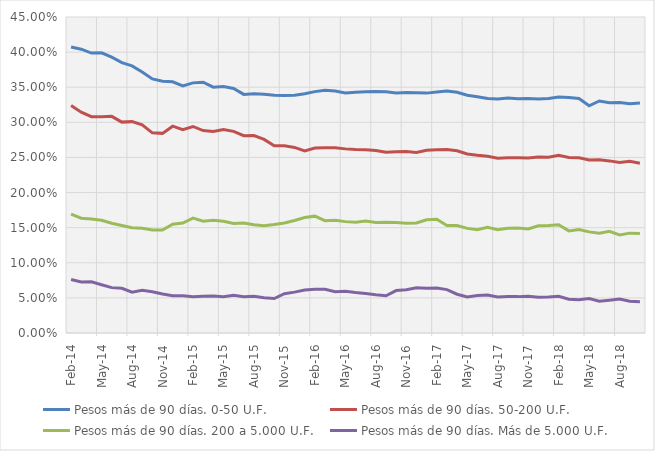
| Category | Pesos más de 90 días. 0-50 U.F. | Pesos más de 90 días. 50-200 U.F. | Pesos más de 90 días. 200 a 5.000 U.F. | Pesos más de 90 días. Más de 5.000 U.F. |
|---|---|---|---|---|
| 2014-02-01 | 0.407 | 0.324 | 0.169 | 0.076 |
| 2014-03-01 | 0.404 | 0.314 | 0.163 | 0.073 |
| 2014-04-01 | 0.399 | 0.308 | 0.162 | 0.073 |
| 2014-05-01 | 0.399 | 0.308 | 0.161 | 0.069 |
| 2014-06-01 | 0.393 | 0.308 | 0.156 | 0.065 |
| 2014-07-01 | 0.385 | 0.3 | 0.153 | 0.064 |
| 2014-08-01 | 0.38 | 0.301 | 0.15 | 0.058 |
| 2014-09-01 | 0.372 | 0.296 | 0.149 | 0.061 |
| 2014-10-01 | 0.362 | 0.285 | 0.147 | 0.059 |
| 2014-11-01 | 0.359 | 0.284 | 0.147 | 0.056 |
| 2014-12-01 | 0.358 | 0.294 | 0.155 | 0.053 |
| 2015-01-01 | 0.352 | 0.29 | 0.157 | 0.053 |
| 2015-02-01 | 0.356 | 0.294 | 0.164 | 0.052 |
| 2015-03-01 | 0.357 | 0.288 | 0.159 | 0.052 |
| 2015-04-01 | 0.35 | 0.287 | 0.161 | 0.053 |
| 2015-05-01 | 0.351 | 0.29 | 0.159 | 0.052 |
| 2015-06-01 | 0.348 | 0.287 | 0.156 | 0.054 |
| 2015-07-01 | 0.34 | 0.281 | 0.157 | 0.052 |
| 2015-08-01 | 0.341 | 0.281 | 0.154 | 0.052 |
| 2015-09-01 | 0.34 | 0.276 | 0.153 | 0.05 |
| 2015-10-01 | 0.339 | 0.267 | 0.154 | 0.049 |
| 2015-11-01 | 0.338 | 0.267 | 0.157 | 0.056 |
| 2015-12-01 | 0.339 | 0.264 | 0.16 | 0.058 |
| 2016-01-01 | 0.341 | 0.259 | 0.164 | 0.061 |
| 2016-02-01 | 0.344 | 0.263 | 0.166 | 0.062 |
| 2016-03-01 | 0.346 | 0.264 | 0.16 | 0.062 |
| 2016-04-01 | 0.345 | 0.264 | 0.161 | 0.059 |
| 2016-05-01 | 0.342 | 0.262 | 0.159 | 0.059 |
| 2016-06-01 | 0.343 | 0.261 | 0.158 | 0.058 |
| 2016-07-01 | 0.344 | 0.261 | 0.159 | 0.056 |
| 2016-08-01 | 0.344 | 0.26 | 0.157 | 0.054 |
| 2016-09-01 | 0.343 | 0.257 | 0.158 | 0.053 |
| 2016-10-01 | 0.342 | 0.258 | 0.157 | 0.06 |
| 2016-11-01 | 0.343 | 0.258 | 0.156 | 0.062 |
| 2016-12-01 | 0.342 | 0.257 | 0.157 | 0.064 |
| 2017-01-01 | 0.342 | 0.26 | 0.161 | 0.064 |
| 2017-02-01 | 0.343 | 0.261 | 0.162 | 0.064 |
| 2017-03-01 | 0.345 | 0.261 | 0.153 | 0.062 |
| 2017-04-01 | 0.343 | 0.259 | 0.153 | 0.055 |
| 2017-05-01 | 0.338 | 0.255 | 0.149 | 0.051 |
| 2017-06-01 | 0.336 | 0.253 | 0.147 | 0.053 |
| 2017-07-01 | 0.334 | 0.252 | 0.151 | 0.054 |
| 2017-08-01 | 0.333 | 0.249 | 0.147 | 0.051 |
| 2017-09-01 | 0.335 | 0.249 | 0.149 | 0.052 |
| 2017-10-01 | 0.334 | 0.25 | 0.149 | 0.052 |
| 2017-11-01 | 0.334 | 0.249 | 0.148 | 0.052 |
| 2017-12-01 | 0.333 | 0.25 | 0.153 | 0.051 |
| 2018-01-01 | 0.334 | 0.25 | 0.153 | 0.051 |
| 2018-02-01 | 0.336 | 0.253 | 0.154 | 0.052 |
| 2018-03-01 | 0.335 | 0.25 | 0.145 | 0.048 |
| 2018-04-01 | 0.334 | 0.249 | 0.147 | 0.047 |
| 2018-05-01 | 0.324 | 0.246 | 0.144 | 0.049 |
| 2018-06-01 | 0.33 | 0.247 | 0.142 | 0.045 |
| 2018-07-01 | 0.328 | 0.245 | 0.145 | 0.047 |
| 2018-08-01 | 0.328 | 0.243 | 0.14 | 0.048 |
| 2018-09-01 | 0.327 | 0.245 | 0.142 | 0.045 |
| 2018-10-01 | 0.327 | 0.242 | 0.142 | 0.045 |